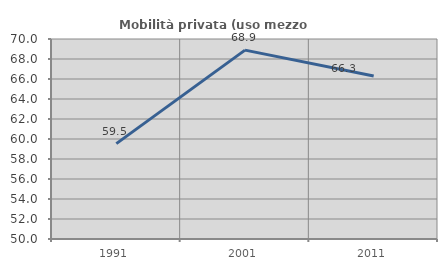
| Category | Mobilità privata (uso mezzo privato) |
|---|---|
| 1991.0 | 59.538 |
| 2001.0 | 68.889 |
| 2011.0 | 66.304 |